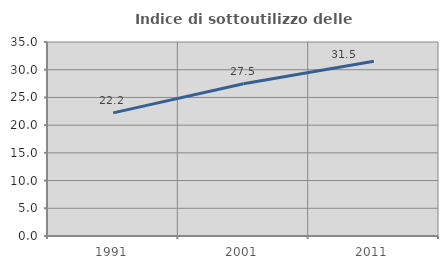
| Category | Indice di sottoutilizzo delle abitazioni  |
|---|---|
| 1991.0 | 22.207 |
| 2001.0 | 27.458 |
| 2011.0 | 31.539 |